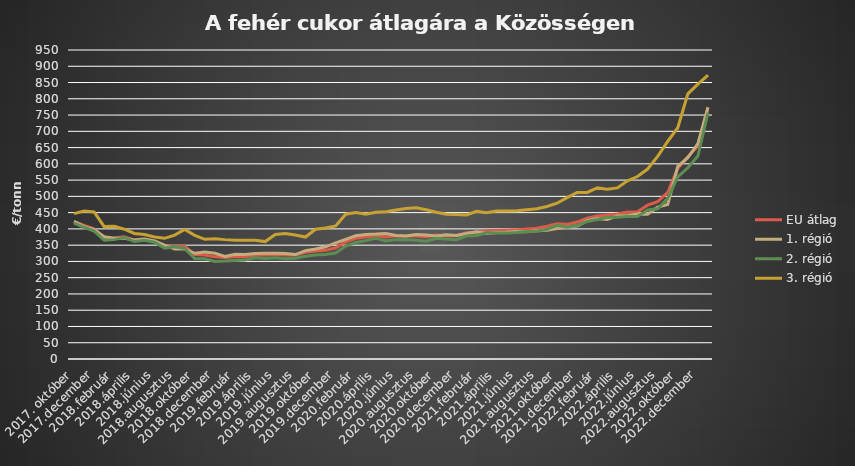
| Category | EU átlag | 1. régió | 2. régió | 3. régió |
|---|---|---|---|---|
| 2017. október | 422 | 423 | 418 | 447 |
| 2017.november | 411 | 407 | 405 | 455 |
| 2017.december | 400 | 398 | 393 | 452 |
| 2018. január | 371 | 376 | 365 | 407 |
| 2018.február | 372 | 371 | 367 | 408 |
| 2018.március | 376 | 371 | 374 | 399 |
| 2018.április | 365 | 366 | 361 | 386 |
| 2018.május | 368 | 369 | 365 | 383 |
| 2018.június | 361 | 363 | 359 | 375 |
| 2018.július | 347 | 350 | 341 | 371 |
| 2018.augusztus | 347 | 338 | 345 | 381 |
| 2018.szeptember | 347 | 338 | 340 | 398 |
| 2018.október | 321 | 325 | 309 | 380 |
| 2018.november | 320 | 329 | 308 | 368 |
| 2018.december | 314 | 325 | 300 | 370 |
| 2019. január | 312 | 315 | 301 | 367 |
| 2019.február | 314 | 322 | 303 | 365 |
| 2019.március | 314 | 321 | 304 | 365 |
| 2019.április | 319 | 324 | 311 | 365 |
| 2019.május | 320 | 325 | 309 | 361 |
| 2019.június | 321 | 325 | 311 | 383 |
| 2019.július | 320 | 324 | 308 | 386 |
| 2019.augusztus | 320 | 321 | 310 | 381 |
| 2019.szeptember | 328 | 333 | 316 | 375 |
| 2019.október | 332 | 338 | 320 | 399 |
| 2019.november | 334 | 345 | 321 | 403 |
| 2019.december | 342 | 357 | 326 | 409 |
| 2020. január | 360 | 368 | 347 | 445 |
| 2020.február | 371 | 379 | 358 | 450 |
| 2020.március | 375 | 383 | 364 | 445 |
| 2020.április | 379 | 384 | 371 | 451 |
| 2020.május | 375 | 386 | 363 | 453 |
| 2020.június | 379 | 380 | 367 | 458 |
| 2020.július | 378 | 378 | 367 | 463 |
| 2020.augusztus | 378 | 383 | 365 | 465 |
| 2020.szeptember | 376 | 381 | 362 | 459 |
| 2020.október | 381 | 378 | 371 | 451 |
| 2020.november | 379 | 382 | 369 | 445 |
| 2020.december | 379 | 380 | 367 | 444 |
| 2021. január | 388 | 386 | 378 | 443 |
| 2021.február | 390 | 391 | 380 | 454 |
| 2021.március | 394 | 386 | 388 | 450 |
| 2021.április | 395 | 389 | 387 | 455 |
| 2021.május | 396 | 390 | 387 | 455 |
| 2021.június | 397 | 392 | 389 | 456 |
| 2021.július | 400 | 391 | 392 | 459 |
| 2021.augusztus | 402 | 394 | 393 | 462 |
| 2021.szeptember | 408 | 396 | 399 | 469 |
| 2021.október | 416 | 401 | 411 | 479 |
| 2021.november | 414 | 406 | 405 | 496 |
| 2021.december | 421 | 409 | 411 | 512 |
| 2022. január | 433 | 425 | 423 | 512 |
| 2022.február | 440 | 432 | 429 | 526 |
| 2022.március | 443 | 429 | 436 | 522 |
| 2022.április | 446 | 440 | 436 | 526 |
| 2022.május | 452 | 441 | 438 | 548 |
| 2022.június | 453 | 446 | 438 | 561 |
| 2022.július | 473 | 445 | 458 | 584 |
| 2022.augusztus | 484 | 467 | 462 | 623 |
| 2022.szeptember | 512 | 475 | 494 | 669 |
| 2022.október | 586 | 592 | 560 | 711 |
| 2022.november | 622 | 619 | 588 | 815 |
| 2022.december | 655 | 662 | 624 | 845 |
| 2023.január | 773 | 774 | 757 | 873 |